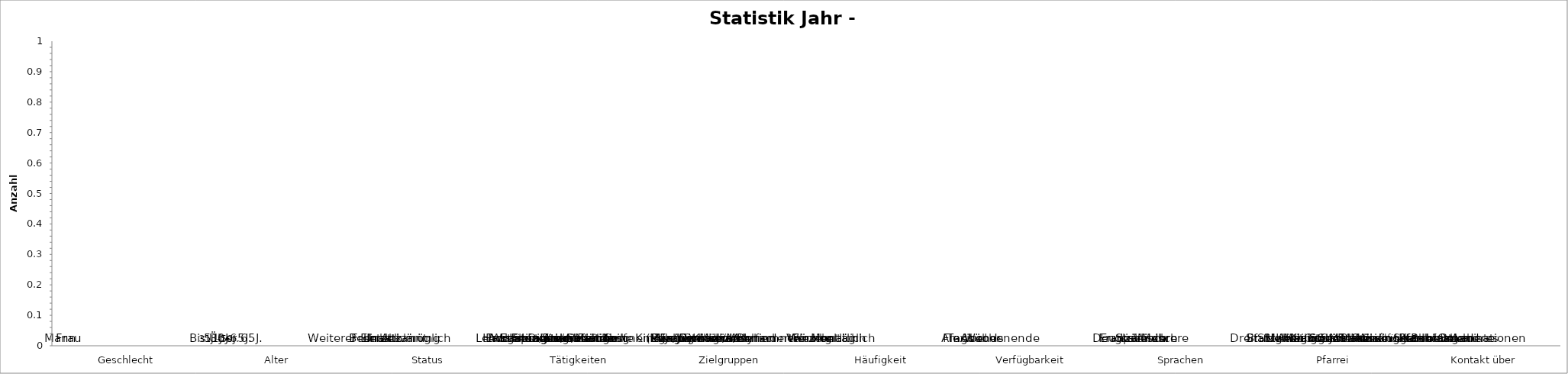
| Category | Series 0 | Series 1 | Series 3 | Series 4 | Series 5 | Series 6 | Series 7 | Series 2 | Series 8 | Series 9 | Series 10 | Series 11 | Series 12 | Series 13 | Series 14 | Series 15 | Series 16 |
|---|---|---|---|---|---|---|---|---|---|---|---|---|---|---|---|---|---|
| Geschlecht | 0 | 0 | 0 | 0 | 0 | 0 | 0 | 0 | 0 | 0 | 0 | 0 | 0 | 0 | 0 | 0 | 0 |
| Alter | 0 | 0 | 0 | 0 | 0 | 0 | 0 | 0 | 0 | 0 | 0 | 0 | 0 | 0 | 0 | 0 | 0 |
| Status | 0 | 0 | 0 | 0 | 0 | 0 | 0 | 0 | 0 | 0 | 0 | 0 | 0 | 0 | 0 | 0 | 0 |
| Tätigkeiten | 0 | 0 | 0 | 0 | 0 | 0 | 0 | 0 | 0 | 0 | 0 | 0 | 0 | 0 | 0 | 0 | 0 |
| Zielgruppen | 0 | 0 | 0 | 0 | 0 | 0 | 0 | 0 | 0 | 0 | 0 | 0 | 0 | 0 | 0 | 0 | 0 |
| Häufigkeit | 0 | 0 | 0 | 0 | 0 | 0 | 0 | 0 | 0 | 0 | 0 | 0 | 0 | 0 | 0 | 0 | 0 |
| Verfügbarkeit | 0 | 0 | 0 | 0 | 0 | 0 | 0 | 0 | 0 | 0 | 0 | 0 | 0 | 0 | 0 | 0 | 0 |
| Sprachen | 0 | 0 | 0 | 0 | 0 | 0 | 0 | 0 | 0 | 0 | 0 | 0 | 0 | 0 | 0 | 0 | 0 |
| Pfarrei | 0 | 0 | 0 | 0 | 0 | 0 | 0 | 0 | 0 | 0 | 0 | 0 | 0 | 0 | 0 | 0 | 0 |
| Kontakt über | 0 | 0 | 0 | 0 | 0 | 0 | 0 | 0 | 0 | 0 | 0 | 0 | 0 | 0 | 0 | 0 | 0 |